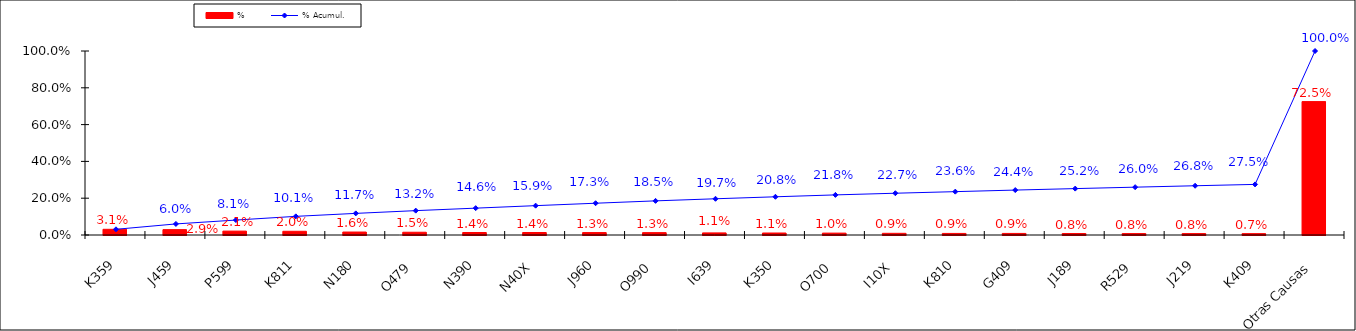
| Category | % |
|---|---|
| K359 | 0.031 |
| J459 | 0.029 |
| P599 | 0.021 |
| K811 | 0.02 |
| N180 | 0.016 |
| O479 | 0.015 |
| N390 | 0.014 |
| N40X | 0.014 |
| J960 | 0.013 |
| O990 | 0.013 |
| I639 | 0.011 |
| K350 | 0.011 |
| O700 | 0.01 |
| I10X | 0.009 |
| K810 | 0.009 |
| G409 | 0.009 |
| J189 | 0.008 |
| R529 | 0.008 |
| J219 | 0.008 |
| K409 | 0.007 |
| Otras Causas | 0.725 |